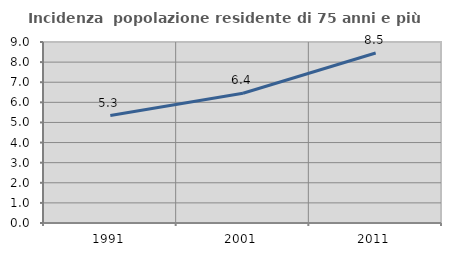
| Category | Incidenza  popolazione residente di 75 anni e più |
|---|---|
| 1991.0 | 5.341 |
| 2001.0 | 6.45 |
| 2011.0 | 8.454 |